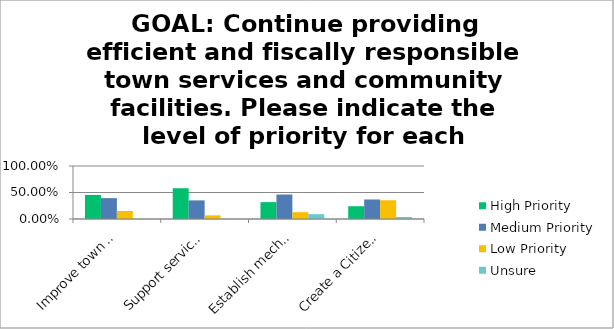
| Category | High Priority | Medium Priority | Low Priority | Unsure |
|---|---|---|---|---|
| Improve town outreach and communication internally, and externally to residents for purposes of civic engagement and emergency response preparedness. | 0.454 | 0.394 | 0.152 | 0 |
| Support services for seniors, disadvantaged residents, and veterans. | 0.58 | 0.351 | 0.069 | 0 |
| Establish mechanisms and policies linking the Master Plan to staff, board and commission work plans, budgets, and capital projects. | 0.318 | 0.462 | 0.129 | 0.091 |
| Create a Citizens’ Academy to promote citizen engagement through classes, information sharing, and events where participants learn about the different functions of local government and opportunities to get involved. | 0.241 | 0.368 | 0.353 | 0.038 |